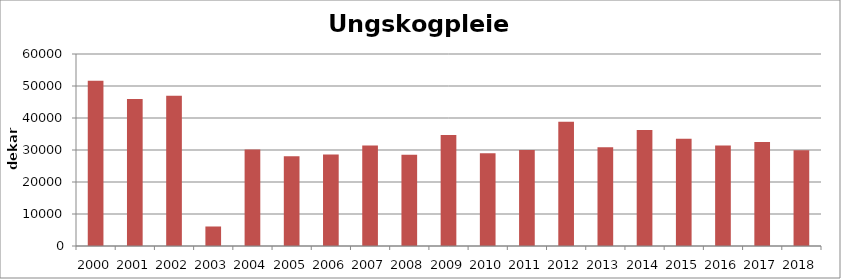
| Category | Totalt |
|---|---|
| 2000 | 51672 |
| 2001 | 45933 |
| 2002 | 46920 |
| 2003 | 6098 |
| 2004 | 30157 |
| 2005 | 28080 |
| 2006 | 28592 |
| 2007 | 31423 |
| 2008 | 28550 |
| 2009 | 34724 |
| 2010 | 28985 |
| 2011 | 29976 |
| 2012 | 38862 |
| 2013 | 30862 |
| 2014 | 36221 |
| 2015 | 33551 |
| 2016 | 31443 |
| 2017 | 32470 |
| 2018 | 29885 |